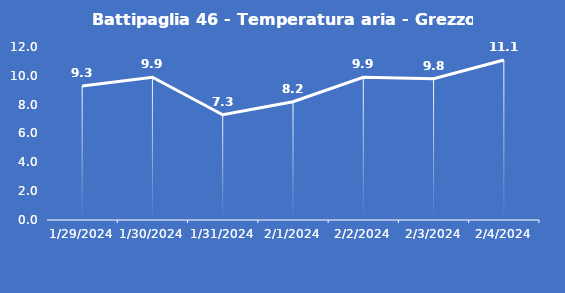
| Category | Battipaglia 46 - Temperatura aria - Grezzo (°C) |
|---|---|
| 1/29/24 | 9.3 |
| 1/30/24 | 9.9 |
| 1/31/24 | 7.3 |
| 2/1/24 | 8.2 |
| 2/2/24 | 9.9 |
| 2/3/24 | 9.8 |
| 2/4/24 | 11.1 |